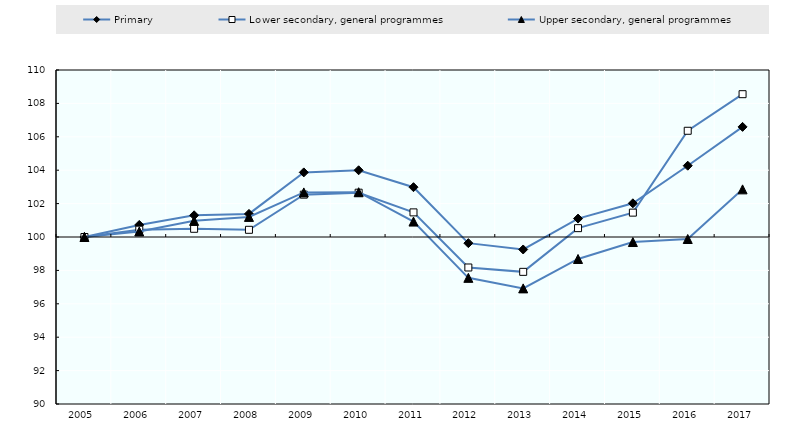
| Category | Primary   | Lower secondary, general programmes  | Upper secondary, general programmes |
|---|---|---|---|
| 2005.0 | 100 | 100 | 100 |
| 2006.0 | 100.721 | 100.438 | 100.329 |
| 2007.0 | 101.3 | 100.492 | 100.966 |
| 2008.0 | 101.382 | 100.431 | 101.204 |
| 2009.0 | 103.868 | 102.536 | 102.67 |
| 2010.0 | 103.995 | 102.653 | 102.681 |
| 2011.0 | 102.984 | 101.474 | 100.924 |
| 2012.0 | 99.632 | 98.174 | 97.554 |
| 2013.0 | 99.253 | 97.913 | 96.923 |
| 2014.0 | 101.103 | 100.53 | 98.684 |
| 2015.0 | 102.017 | 101.459 | 99.7 |
| 2016.0 | 104.269 | 106.361 | 99.88 |
| 2017.0 | 106.594 | 108.552 | 102.852 |